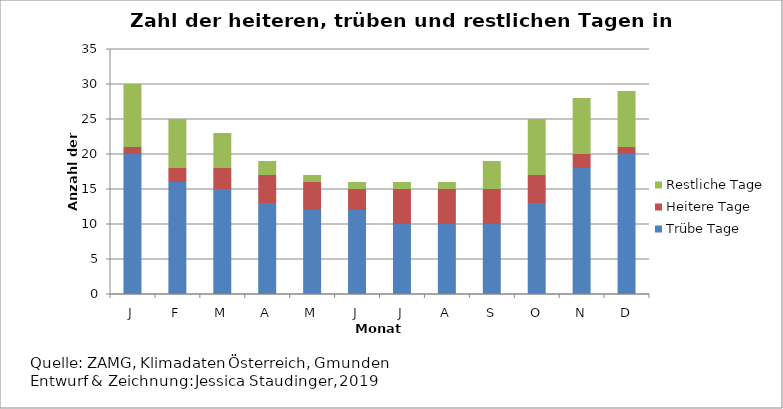
| Category | Trübe Tage | Heitere Tage | Restliche Tage |
|---|---|---|---|
| J | 20 | 1 | 9 |
| F | 16 | 2 | 7 |
| M | 15 | 3 | 5 |
| A | 13 | 4 | 2 |
| M | 12 | 4 | 1 |
| J | 12 | 3 | 1 |
| J | 10 | 5 | 1 |
| A | 10 | 5 | 1 |
| S | 10 | 5 | 4 |
| O | 13 | 4 | 8 |
| N | 18 | 2 | 8 |
| D | 20 | 1 | 8 |